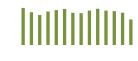
| Category | Saldo [ (1)-(2) ] |
|---|---|
| 0 | 329612.931 |
| 1 | 291358.085 |
| 2 | 266512.131 |
| 3 | 297562.723 |
| 4 | 310243.352 |
| 5 | 320714.531 |
| 6 | 286229.119 |
| 7 | 282809.198 |
| 8 | 306315.684 |
| 9 | 322195.815 |
| 10 | 306185.726 |
| 11 | 300797.708 |
| 12 | 287185.489 |
| 13 | 227003.004 |